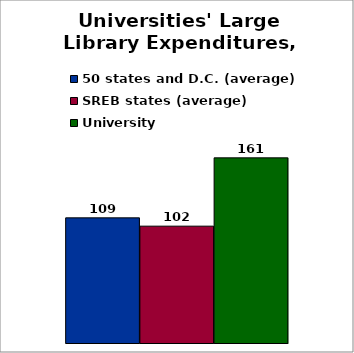
| Category | 50 states and D.C. (average) | SREB states (average) | University |
|---|---|---|---|
| 0 | 108.818 | 101.6 | 161 |